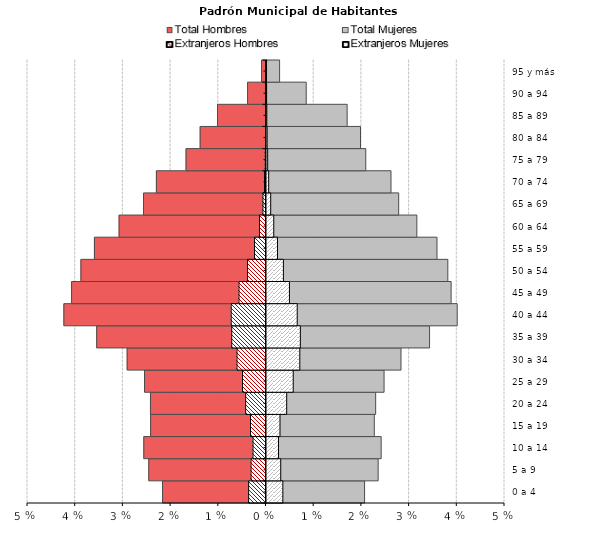
| Category | Total Hombres | Total Mujeres | Extranjeros Hombres | Extranjeros Mujeres |
|---|---|---|---|---|
| 0 a 4 | -0.022 | 0.021 | -0.004 | 0.003 |
| 5 a 9 | -0.025 | 0.023 | -0.003 | 0.003 |
| 10 a 14 | -0.026 | 0.024 | -0.003 | 0.003 |
| 15 a 19 | -0.024 | 0.023 | -0.003 | 0.003 |
| 20 a 24 | -0.024 | 0.023 | -0.004 | 0.004 |
| 25 a 29 | -0.025 | 0.025 | -0.005 | 0.006 |
| 30 a 34 | -0.029 | 0.028 | -0.006 | 0.007 |
| 35 a 39 | -0.035 | 0.034 | -0.007 | 0.007 |
| 40 a 44 | -0.042 | 0.04 | -0.007 | 0.006 |
| 45 a 49 | -0.041 | 0.039 | -0.006 | 0.005 |
| 50 a 54 | -0.039 | 0.038 | -0.004 | 0.004 |
| 55 a 59 | -0.036 | 0.036 | -0.002 | 0.002 |
| 60 a 64 | -0.031 | 0.032 | -0.001 | 0.002 |
| 65 a 69 | -0.026 | 0.028 | -0.001 | 0.001 |
| 70 a 74 | -0.023 | 0.026 | 0 | 0 |
| 75 a 79 | -0.017 | 0.021 | 0 | 0 |
| 80 a 84 | -0.014 | 0.02 | 0 | 0 |
| 85 a 89 | -0.01 | 0.017 | 0 | 0 |
| 90 a 94 | -0.004 | 0.008 | 0 | 0 |
| 95 y más | -0.001 | 0.003 | 0 | 0 |